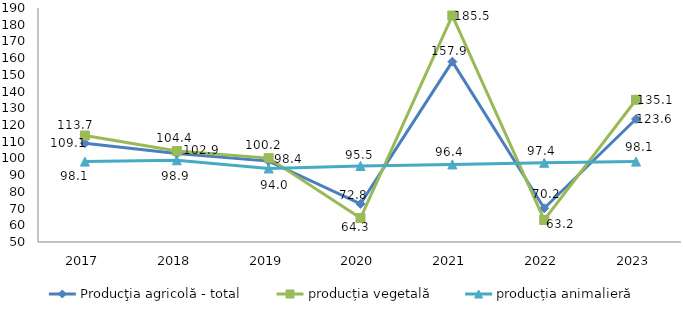
| Category | Producţia agricolă - total | producția vegetală | producția animalieră |
|---|---|---|---|
| 2017.0 | 109.1 | 113.7 | 98.1 |
| 2018.0 | 102.9 | 104.4 | 98.9 |
| 2019.0 | 98.4 | 100.2 | 94 |
| 2020.0 | 72.8 | 64.3 | 95.5 |
| 2021.0 | 157.9 | 185.5 | 96.4 |
| 2022.0 | 70.2 | 63.2 | 97.4 |
| 2023.0 | 123.6 | 135.1 | 98.1 |